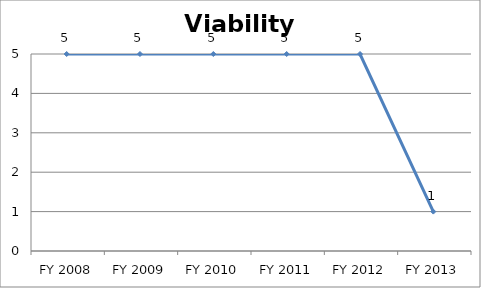
| Category | Viability score |
|---|---|
| FY 2013 | 1 |
| FY 2012 | 5 |
| FY 2011 | 5 |
| FY 2010 | 5 |
| FY 2009 | 5 |
| FY 2008 | 5 |